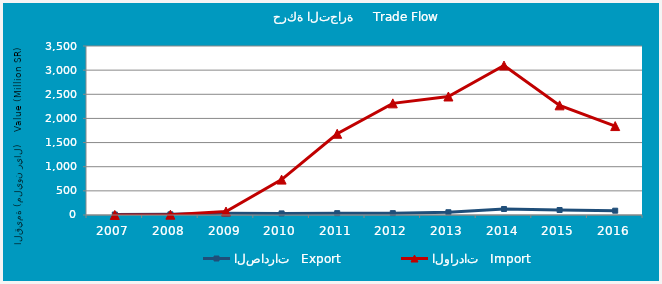
| Category | الصادرات   Export | الواردات   Import |
|---|---|---|
| 2007.0 | 10.383 | 0.883 |
| 2008.0 | 13.253 | 6.476 |
| 2009.0 | 35.865 | 71.574 |
| 2010.0 | 33.076 | 733.087 |
| 2011.0 | 38.414 | 1682.373 |
| 2012.0 | 38.684 | 2311.904 |
| 2013.0 | 57.383 | 2454.384 |
| 2014.0 | 124.361 | 3095.666 |
| 2015.0 | 103.47 | 2270.946 |
| 2016.0 | 89.132 | 1841.772 |